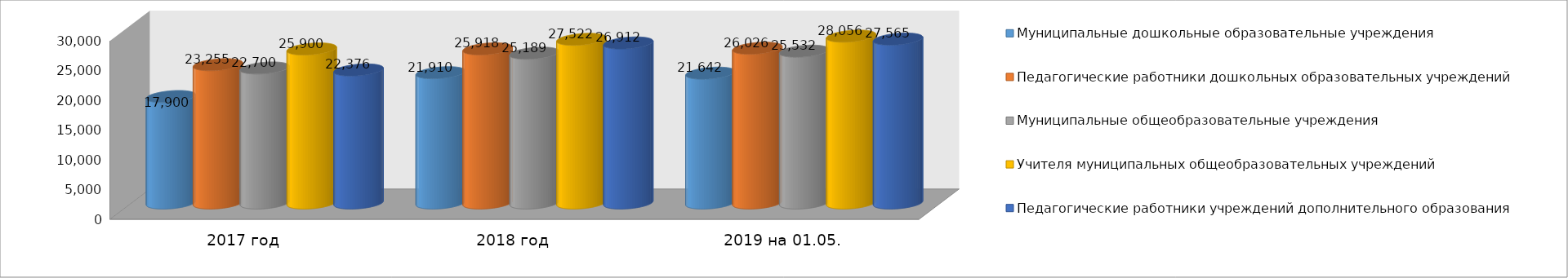
| Category | Муниципальные дошкольные образовательные учреждения | Педагогические работники дошкольных образовательных учреждений | Муниципальные общеобразовательные учреждения | Учителя муниципальных общеобразовательных учреждений | Педагогические работники учреждений дополнительного образования |
|---|---|---|---|---|---|
| 2017 год | 17900 | 23255 | 22700 | 25900 | 22376 |
| 2018 год | 21910 | 25918 | 25189 | 27522 | 26912 |
| 2019 на 01.05. | 21835 | 26026 | 25532 | 28056 | 27565 |